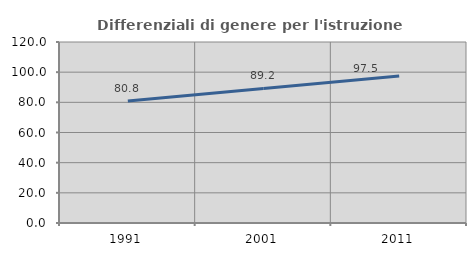
| Category | Differenziali di genere per l'istruzione superiore |
|---|---|
| 1991.0 | 80.849 |
| 2001.0 | 89.209 |
| 2011.0 | 97.479 |